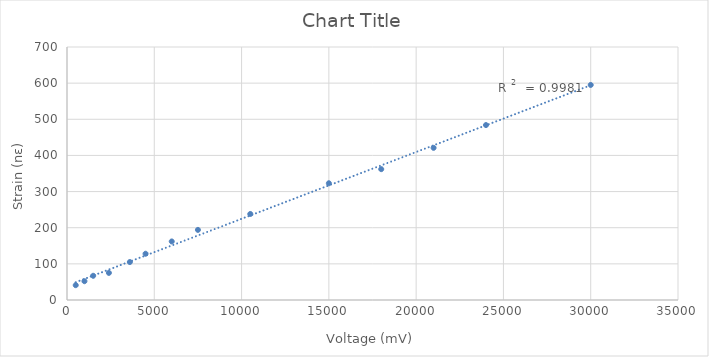
| Category | Series 0 |
|---|---|
| 500.0 | 41 |
| 1000.0 | 52 |
| 1500.0 | 67 |
| 2400.0 | 75 |
| 3600.0 | 105 |
| 4500.0 | 128 |
| 6000.0 | 162 |
| 7500.0 | 194 |
| 10500.0 | 238 |
| 15000.0 | 323 |
| 18000.0 | 362 |
| 21000.0 | 421 |
| 24000.0 | 484 |
| 30000.0 | 595 |